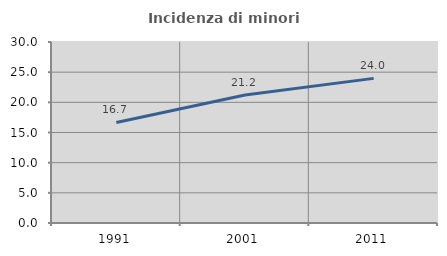
| Category | Incidenza di minori stranieri |
|---|---|
| 1991.0 | 16.667 |
| 2001.0 | 21.212 |
| 2011.0 | 23.973 |